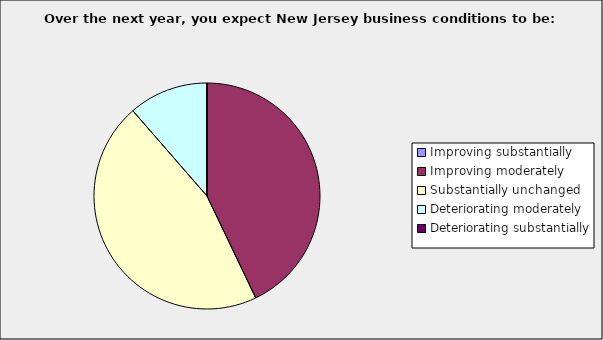
| Category | Series 0 |
|---|---|
| Improving substantially | 0 |
| Improving moderately | 0.429 |
| Substantially unchanged | 0.457 |
| Deteriorating moderately | 0.114 |
| Deteriorating substantially | 0 |